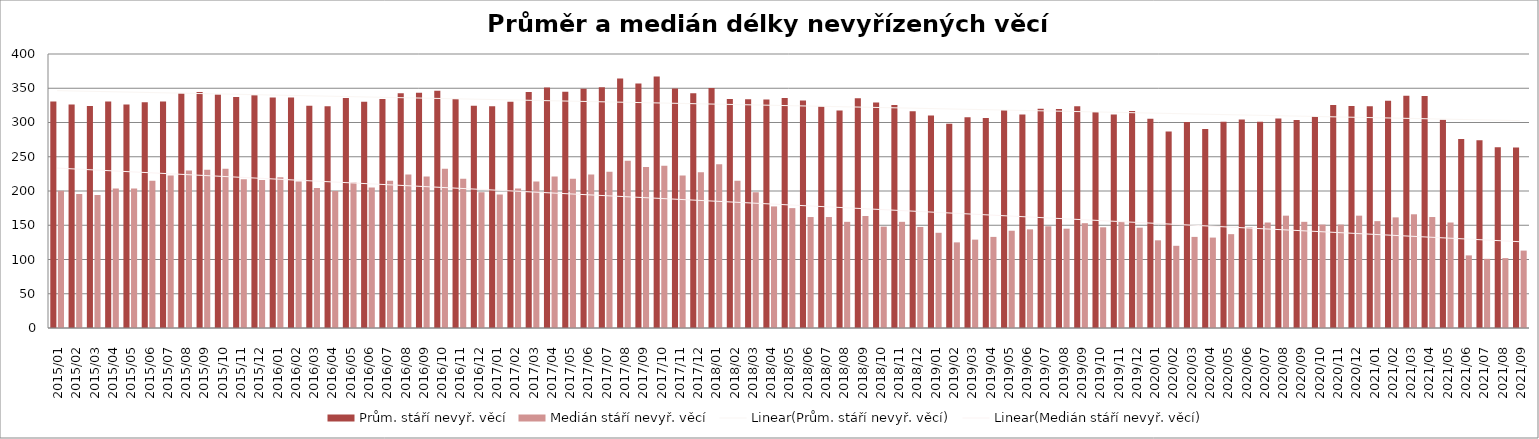
| Category | Prům. stáří nevyř. věcí | Medián stáří nevyř. věcí |
|---|---|---|
| 2015/01 | 330.61 | 200.5 |
| 2015/02 | 326.41 | 195.5 |
| 2015/03 | 324.13 | 194 |
| 2015/04 | 330.71 | 203.5 |
| 2015/05 | 326.22 | 203.5 |
| 2015/06 | 329.61 | 215 |
| 2015/07 | 330.7 | 222.5 |
| 2015/08 | 342.52 | 230 |
| 2015/09 | 344.61 | 231 |
| 2015/10 | 340.9 | 232.5 |
| 2015/11 | 337.39 | 217 |
| 2015/12 | 339.79 | 216 |
| 2016/01 | 336.35 | 220 |
| 2016/02 | 336.35 | 214 |
| 2016/03 | 324.32 | 204.5 |
| 2016/04 | 323.79 | 200 |
| 2016/05 | 335.63 | 212.5 |
| 2016/06 | 330.14 | 205 |
| 2016/07 | 334.46 | 215 |
| 2016/08 | 342.71 | 224 |
| 2016/09 | 343.33 | 221 |
| 2016/10 | 346.36 | 232.5 |
| 2016/11 | 334.21 | 218 |
| 2016/12 | 324.62 | 198 |
| 2017/01 | 323.8 | 195 |
| 2017/02 | 330.35 | 203.5 |
| 2017/03 | 344.38 | 214 |
| 2017/04 | 351.07 | 221 |
| 2017/05 | 345.05 | 218 |
| 2017/06 | 349.11 | 224 |
| 2017/07 | 351.29 | 228 |
| 2017/08 | 364.2 | 244 |
| 2017/09 | 356.89 | 235 |
| 2017/10 | 367.23 | 237 |
| 2017/11 | 349.7 | 222.5 |
| 2017/12 | 342.69 | 227.5 |
| 2018/01 | 350.35 | 239 |
| 2018/02 | 334.43 | 215 |
| 2018/03 | 333.85 | 198 |
| 2018/04 | 333.6 | 177.5 |
| 2018/05 | 335.81 | 175 |
| 2018/06 | 332.15 | 162 |
| 2018/07 | 323.86 | 162 |
| 2018/08 | 317.43 | 155 |
| 2018/09 | 335.34 | 163.5 |
| 2018/10 | 329.05 | 148 |
| 2018/11 | 325.62 | 155 |
| 2018/12 | 316.27 | 147.5 |
| 2019/01 | 310.21 | 139 |
| 2019/02 | 298.27 | 125 |
| 2019/03 | 307.58 | 129 |
| 2019/04 | 306.64 | 133 |
| 2019/05 | 318.19 | 142 |
| 2019/06 | 311.63 | 144 |
| 2019/07 | 320.09 | 148.5 |
| 2019/08 | 319.82 | 145 |
| 2019/09 | 323.71 | 153 |
| 2019/10 | 315.42 | 147 |
| 2019/11 | 311.62 | 155 |
| 2019/12 | 316.82 | 146.5 |
| 2020/01 | 305.61 | 128 |
| 2020/02 | 286.71 | 120 |
| 2020/03 | 300.81 | 133 |
| 2020/04 | 290.34 | 132 |
| 2020/05 | 301.26 | 137 |
| 2020/06 | 304.22 | 147 |
| 2020/07 | 301.04 | 154 |
| 2020/08 | 305.89 | 164 |
| 2020/09 | 303.68 | 155 |
| 2020/10 | 309.51 | 151 |
| 2020/11 | 325.69 | 151 |
| 2020/12 | 324.03 | 164 |
| 2021/01 | 323.75 | 156 |
| 2021/02 | 331.64 | 161.5 |
| 2021/03 | 338.92 | 166 |
| 2021/04 | 338.77 | 162 |
| 2021/05 | 304.02 | 154 |
| 2021/06 | 275.92 | 106 |
| 2021/07 | 274.19 | 101 |
| 2021/08 | 263.99 | 102 |
| 2021/09 | 263.55 | 113 |